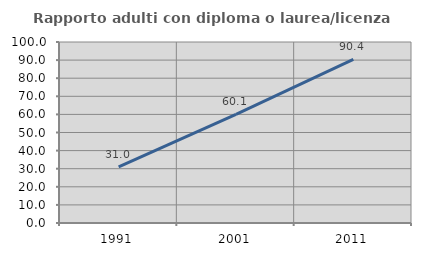
| Category | Rapporto adulti con diploma o laurea/licenza media  |
|---|---|
| 1991.0 | 31.034 |
| 2001.0 | 60.055 |
| 2011.0 | 90.445 |